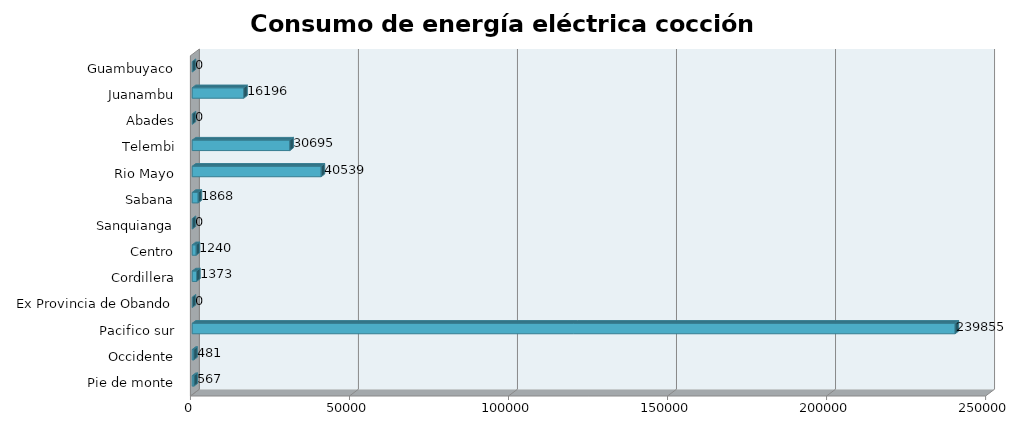
| Category | Series 0 |
|---|---|
| Pie de monte | 566.765 |
| Occidente | 480.715 |
| Pacifico sur | 239854.721 |
| Ex Provincia de Obando | 0 |
| Cordillera | 1373.267 |
| Centro | 1239.697 |
| Sanquianga | 0 |
| Sabana | 1867.62 |
| Rio Mayo | 40539.368 |
| Telembi | 30694.834 |
| Abades | 0 |
| Juanambu | 16195.765 |
| Guambuyaco | 0 |